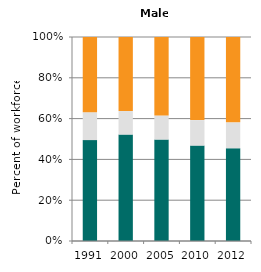
| Category | Agriculture | Industry | Services |
|---|---|---|---|
| 1991.0 | 49.449 | 13.651 | 36.9 |
| 2000.0 | 52.176 | 11.523 | 36.301 |
| 2005.0 | 49.725 | 11.825 | 38.45 |
| 2010.0 | 46.777 | 12.486 | 40.738 |
| 2012.0 | 45.457 | 12.695 | 41.847 |